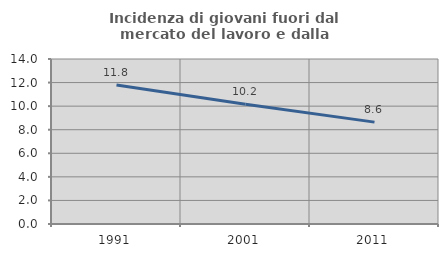
| Category | Incidenza di giovani fuori dal mercato del lavoro e dalla formazione  |
|---|---|
| 1991.0 | 11.789 |
| 2001.0 | 10.169 |
| 2011.0 | 8.644 |